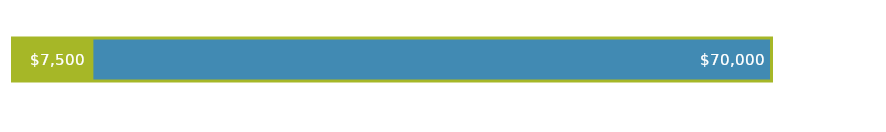
| Category | FINANZIAMENTO TOTALE | SPESE TOTALI |
|---|---|---|
| 0 | 70000 | 7500 |